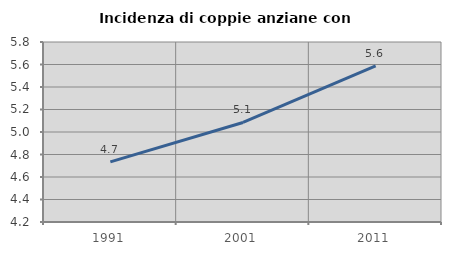
| Category | Incidenza di coppie anziane con figli |
|---|---|
| 1991.0 | 4.735 |
| 2001.0 | 5.085 |
| 2011.0 | 5.589 |